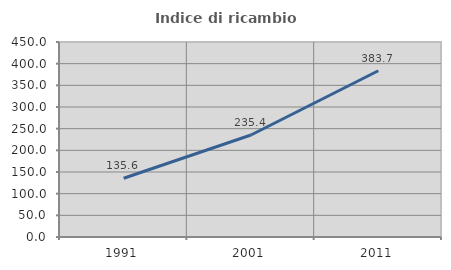
| Category | Indice di ricambio occupazionale  |
|---|---|
| 1991.0 | 135.556 |
| 2001.0 | 235.385 |
| 2011.0 | 383.721 |